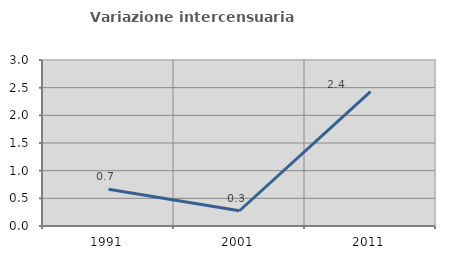
| Category | Variazione intercensuaria annua |
|---|---|
| 1991.0 | 0.664 |
| 2001.0 | 0.276 |
| 2011.0 | 2.429 |